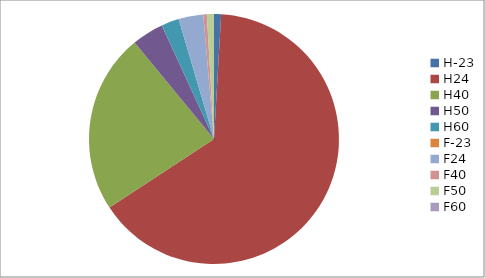
| Category | Series 0 |
|---|---|
| H-23 | 2 |
| H24 | 142 |
| H40 | 51 |
| H50 | 9 |
| H60 | 5 |
| F-23 | 0 |
| F24 | 7 |
| F40 | 1 |
| F50 | 2 |
| F60 | 0 |